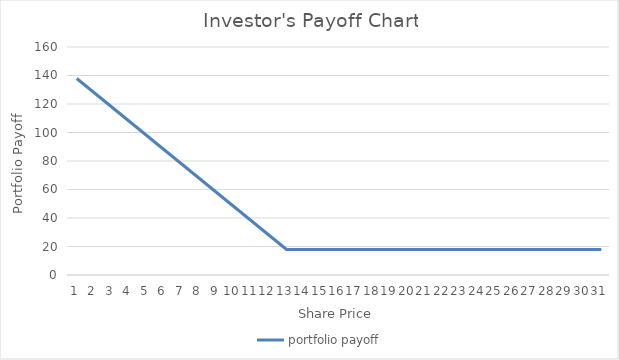
| Category | portfolio payoff |
|---|---|
| 0 | 137.91 |
| 1 | 127.91 |
| 2 | 117.91 |
| 3 | 107.91 |
| 4 | 97.91 |
| 5 | 87.91 |
| 6 | 77.91 |
| 7 | 67.91 |
| 8 | 57.91 |
| 9 | 47.91 |
| 10 | 37.91 |
| 11 | 27.91 |
| 12 | 17.91 |
| 13 | 17.91 |
| 14 | 17.91 |
| 15 | 17.91 |
| 16 | 17.91 |
| 17 | 17.91 |
| 18 | 17.91 |
| 19 | 17.91 |
| 20 | 17.91 |
| 21 | 17.91 |
| 22 | 17.91 |
| 23 | 17.91 |
| 24 | 17.91 |
| 25 | 17.91 |
| 26 | 17.91 |
| 27 | 17.91 |
| 28 | 17.91 |
| 29 | 17.91 |
| 30 | 17.91 |